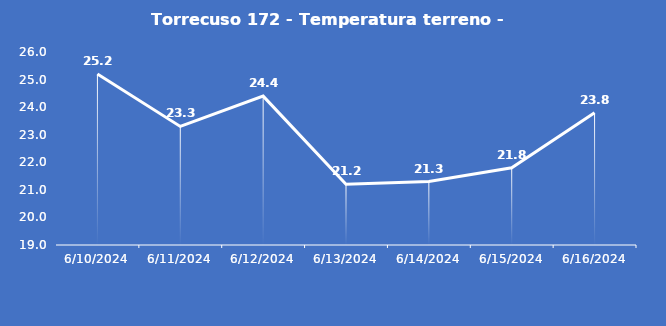
| Category | Torrecuso 172 - Temperatura terreno - Grezzo (°C) |
|---|---|
| 6/10/24 | 25.2 |
| 6/11/24 | 23.3 |
| 6/12/24 | 24.4 |
| 6/13/24 | 21.2 |
| 6/14/24 | 21.3 |
| 6/15/24 | 21.8 |
| 6/16/24 | 23.8 |